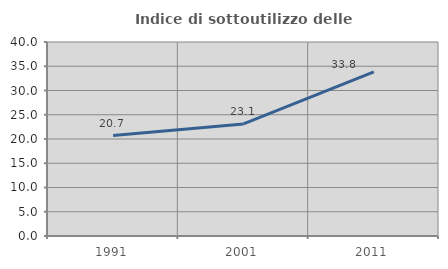
| Category | Indice di sottoutilizzo delle abitazioni  |
|---|---|
| 1991.0 | 20.71 |
| 2001.0 | 23.113 |
| 2011.0 | 33.84 |